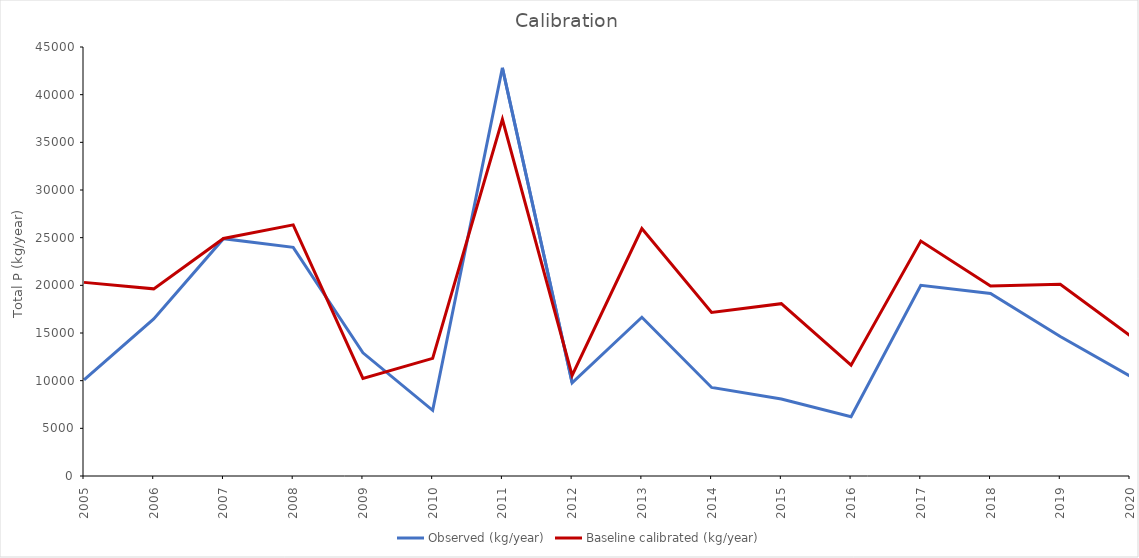
| Category | Observed (kg/year) | Baseline calibrated (kg/year) |
|---|---|---|
| 2005.0 | 10074.26 | 20310 |
| 2006.0 | 16468.45 | 19630 |
| 2007.0 | 24893.949 | 24910 |
| 2008.0 | 23980.667 | 26340 |
| 2009.0 | 12920.165 | 10230 |
| 2010.0 | 6890.7 | 12340 |
| 2011.0 | 42815.641 | 37420 |
| 2012.0 | 9782.671 | 10550 |
| 2013.0 | 16649.916 | 25960 |
| 2014.0 | 9288.707 | 17150 |
| 2015.0 | 8071.832 | 18080 |
| 2016.0 | 6209.699 | 11630 |
| 2017.0 | 20003.039 | 24650 |
| 2018.0 | 19139.244 | 19920 |
| 2019.0 | 14632.481 | 20110 |
| 2020.0 | 10479.943 | 14730 |